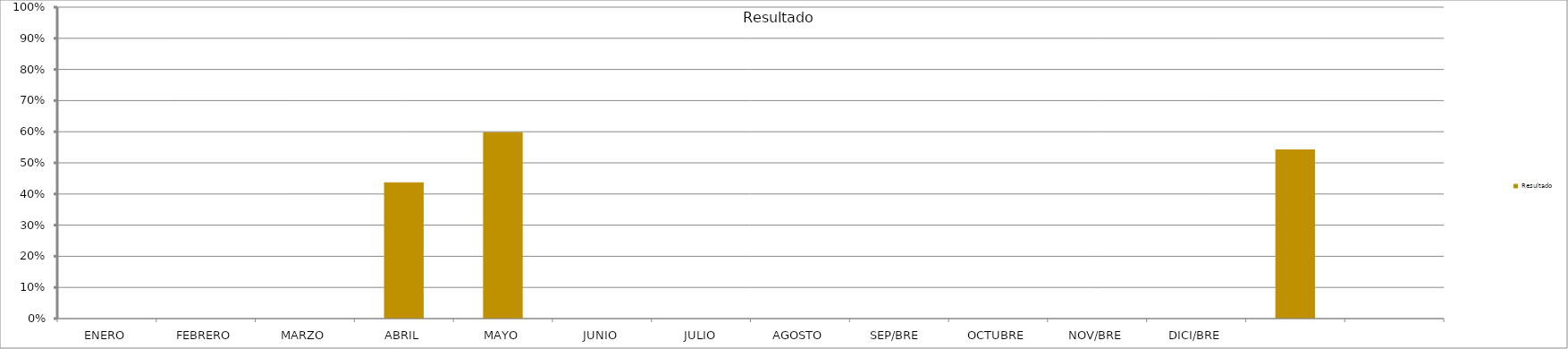
| Category | Resultado  |
|---|---|
| ENERO | 0 |
| FEBRERO | 0 |
| MARZO | 0 |
| ABRIL | 0.437 |
| MAYO | 0.599 |
| JUNIO | 0 |
| JULIO | 0 |
| AGOSTO | 0 |
| SEP/BRE  | 0 |
| OCTUBRE | 0 |
| NOV/BRE | 0 |
| DICI/BRE | 0 |